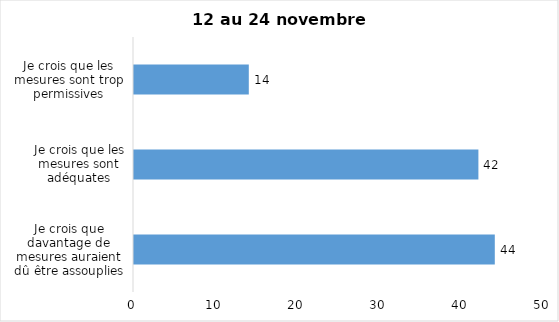
| Category | Series 0 |
|---|---|
| Je crois que davantage de mesures auraient dû être assouplies | 44 |
| Je crois que les mesures sont adéquates | 42 |
| Je crois que les mesures sont trop permissives | 14 |